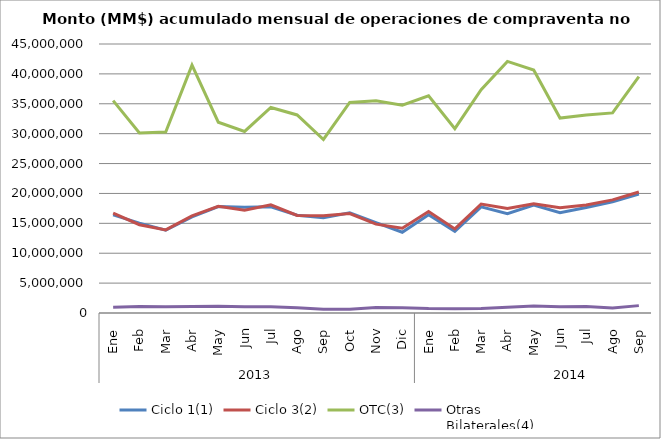
| Category | Ciclo 1(1) | Ciclo 3(2) | OTC(3) | Otras
Bilaterales(4) |
|---|---|---|---|---|
| 0 | 16417241.727 | 16700335.202 | 35523809.408 | 972958.086 |
| 1 | 15037741.172 | 14773657.586 | 30102338.851 | 1073496.596 |
| 2 | 13848943.779 | 13900402.205 | 30273669.122 | 1026617.054 |
| 3 | 16086096.035 | 16245696.168 | 41465554.082 | 1105720.368 |
| 4 | 17801790.619 | 17838763.351 | 31909646.654 | 1133512.85 |
| 5 | 17684542.956 | 17179330.609 | 30372188.279 | 1025162.543 |
| 6 | 17771623.451 | 18089502.524 | 34376831.202 | 1053340.718 |
| 7 | 16359818.954 | 16327115.519 | 33128143.288 | 882723.558 |
| 8 | 15949862.744 | 16281684.387 | 29025705.039 | 624893.462 |
| 9 | 16760948.703 | 16634867.291 | 35234004.542 | 641647.876 |
| 10 | 15133528.556 | 14863555.208 | 35512550.02 | 915020.525 |
| 11 | 13509827.678 | 14192849.668 | 34769513.126 | 877765.247 |
| 12 | 16434121.823 | 16973216.875 | 36341658.718 | 750147.378 |
| 13 | 13675521.943 | 14060199.134 | 30828680.35 | 721919.806 |
| 14 | 17760484.117 | 18231676.991 | 37344676.439 | 768460.999 |
| 15 | 16615436.994 | 17468955.339 | 42094978.158 | 945494.284 |
| 16 | 18046213.572 | 18258193.447 | 40638812.154 | 1185202.419 |
| 17 | 16777760.924 | 17604169.829 | 32614242.011 | 1051618.708 |
| 18 | 17653207.737 | 18067976.125 | 33107498.911 | 1069963.521 |
| 19 | 18582577.233 | 18927801.519 | 33476806.263 | 855141.972 |
| 20 | 19897365.776 | 20231545.747 | 39538700.233 | 1232916.988 |